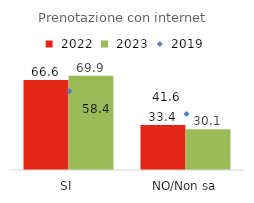
| Category | Series 1 | Series 2 |
|---|---|---|
| SI | 66.6 | 69.9 |
| NO/Non sa | 33.4 | 30.1 |